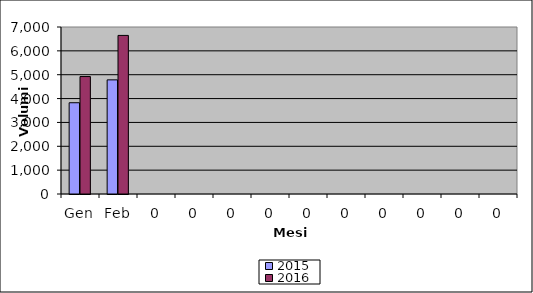
| Category | 2015 | 2016 |
|---|---|---|
| Gen | 3825 | 4923 |
| Feb | 4784 | 6647 |
| 0 | 0 | 0 |
| 0 | 0 | 0 |
| 0 | 0 | 0 |
| 0 | 0 | 0 |
| 0 | 0 | 0 |
| 0 | 0 | 0 |
| 0 | 0 | 0 |
| 0 | 0 | 0 |
| 0 | 0 | 0 |
| 0 | 0 | 0 |